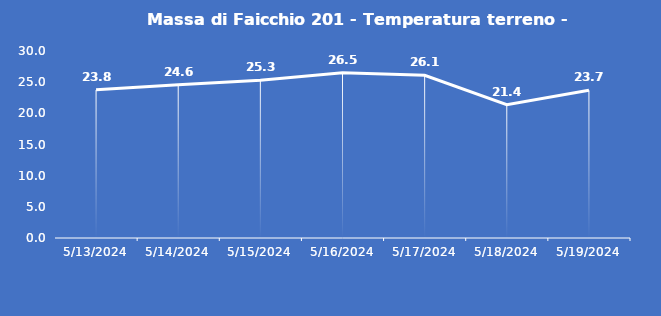
| Category | Massa di Faicchio 201 - Temperatura terreno - Grezzo (°C) |
|---|---|
| 5/13/24 | 23.8 |
| 5/14/24 | 24.6 |
| 5/15/24 | 25.3 |
| 5/16/24 | 26.5 |
| 5/17/24 | 26.1 |
| 5/18/24 | 21.4 |
| 5/19/24 | 23.7 |